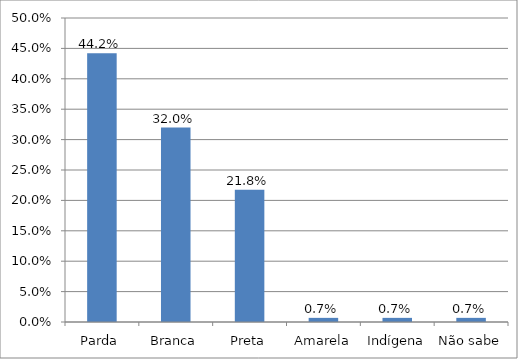
| Category | Series 0 |
|---|---|
| Parda | 0.442 |
| Branca | 0.32 |
| Preta | 0.218 |
| Amarela | 0.007 |
| Indígena | 0.007 |
| Não sabe | 0.007 |